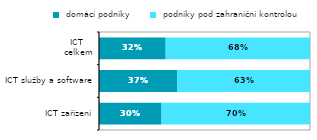
| Category |  domácí podniky |  podniky pod zahraniční kontrolou |
|---|---|---|
|   ICT zařízení | 0.296 | 0.704 |
|  ICT služby a software | 0.37 | 0.63 |
| ICT 
celkem | 0.316 | 0.684 |